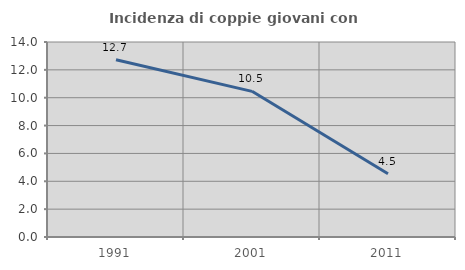
| Category | Incidenza di coppie giovani con figli |
|---|---|
| 1991.0 | 12.727 |
| 2001.0 | 10.458 |
| 2011.0 | 4.545 |